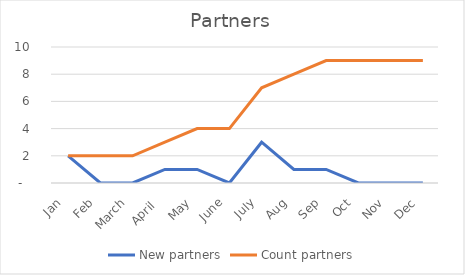
| Category | New partners | Count partners |
|---|---|---|
|  Jan  | 2 | 2 |
|  Feb  | 0 | 2 |
|  March  | 0 | 2 |
|  April   | 1 | 3 |
|  May  | 1 | 4 |
|  June  | 0 | 4 |
|  July  | 3 | 7 |
|  Aug  | 1 | 8 |
|  Sep  | 1 | 9 |
|  Oct  | 0 | 9 |
|  Nov  | 0 | 9 |
|  Dec  | 0 | 9 |